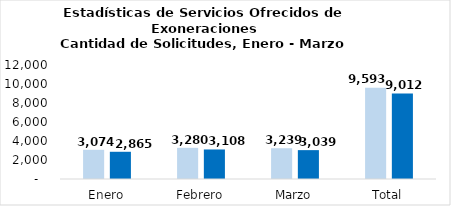
| Category | Tramitadas |
|---|---|
| Enero | 2865 |
| Febrero | 3108 |
| Marzo | 3039 |
| Total | 9012 |